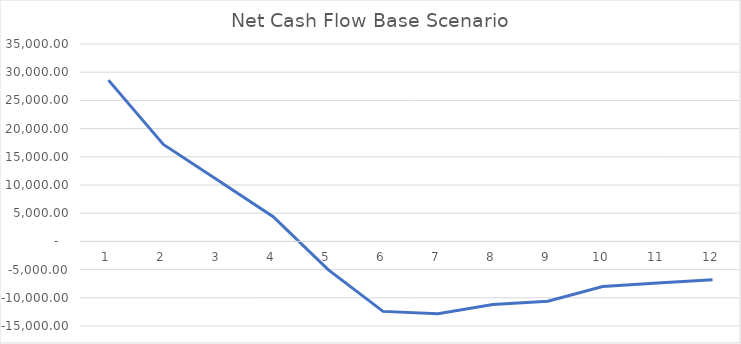
| Category | Series 0 |
|---|---|
| 0 | 28596 |
| 1 | 17193 |
| 2 | 10791 |
| 3 | 4390 |
| 4 | -5010 |
| 5 | -12409 |
| 6 | -12807 |
| 7 | -11204 |
| 8 | -10600 |
| 9 | -7995 |
| 10 | -7389 |
| 11 | -6782 |